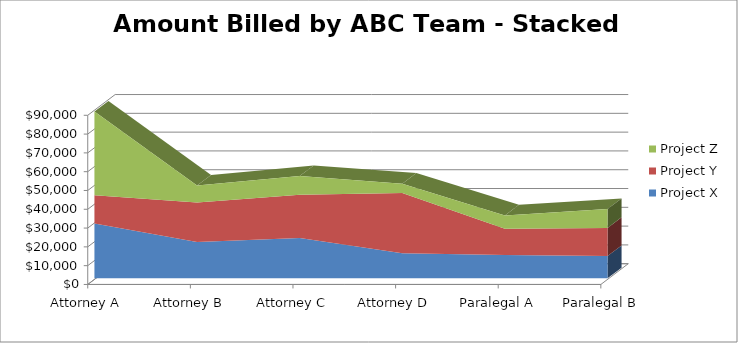
| Category | Project X | Project Y | Project Z |
|---|---|---|---|
| Attorney A | 29765 | 15000 | 44500 |
| Attorney B | 19897 | 21000 | 9000 |
| Attorney C | 22000 | 23000 | 10000 |
| Attorney D | 13908 | 32000 | 5000 |
| Paralegal A | 12999 | 14000 | 7000 |
| Paralegal B | 12400 | 15000 | 10000 |